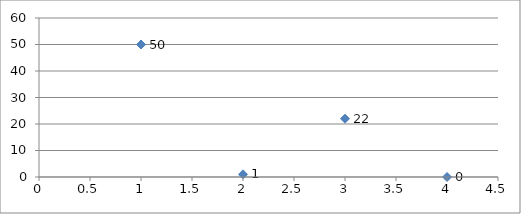
| Category | Series 0 |
|---|---|
| 0 | 50 |
| 1 | 1 |
| 2 | 22 |
| 3 | 0 |